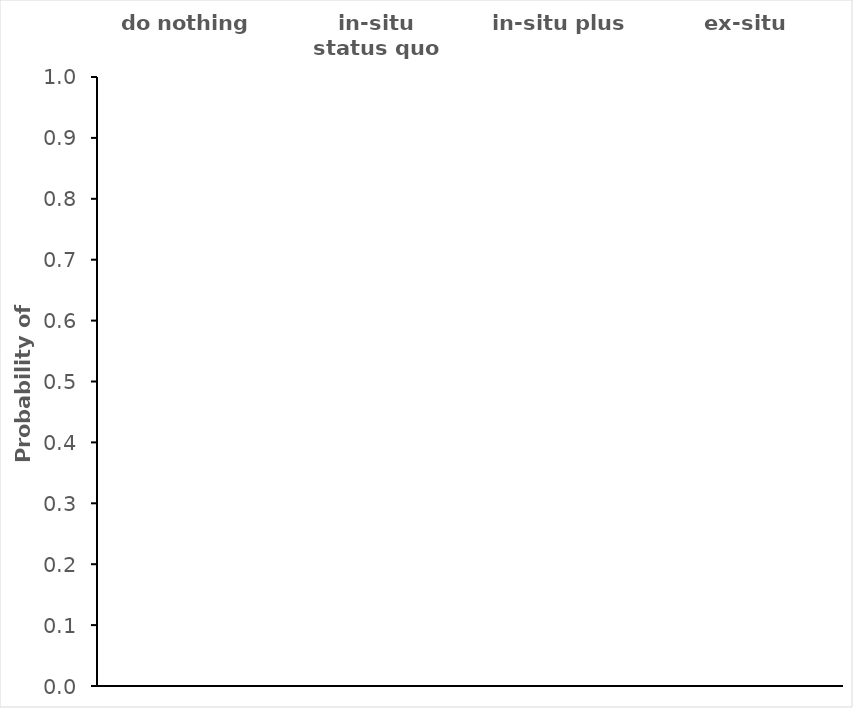
| Category | best estimate |
|---|---|
| do nothing | 0 |
| in-situ status quo | 0 |
| in-situ plus | 0 |
| ex-situ | 0 |